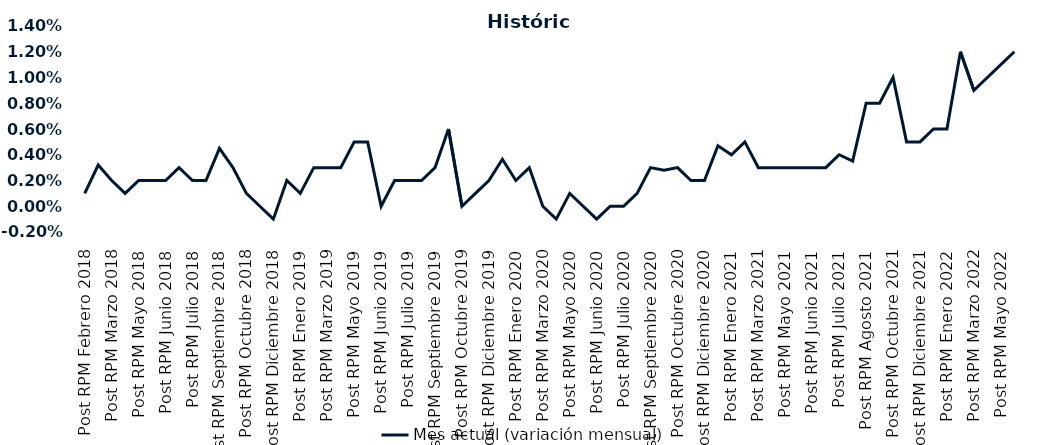
| Category | Mes actual (variación mensual)  |
|---|---|
| Post RPM Febrero 2018 | 0.001 |
| Pre RPM Marzo 2018 | 0.003 |
| Post RPM Marzo 2018 | 0.002 |
| Pre RPM Mayo 2018 | 0.001 |
| Post RPM Mayo 2018 | 0.002 |
| Pre RPM Junio 2018 | 0.002 |
| Post RPM Junio 2018 | 0.002 |
| Pre RPM Julio 2018 | 0.003 |
| Post RPM Julio 2018 | 0.002 |
| Pre RPM Septiembre 2018 | 0.002 |
| Post RPM Septiembre 2018 | 0.004 |
| Pre RPM Octubre 2018 | 0.003 |
| Post RPM Octubre 2018 | 0.001 |
| Pre RPM Diciembre 2018 | 0 |
| Post RPM Diciembre 2018 | -0.001 |
| Pre RPM Enero 2019 | 0.002 |
| Post RPM Enero 2019 | 0.001 |
| Pre RPM Marzo 2019 | 0.003 |
| Post RPM Marzo 2019 | 0.003 |
| Pre RPM Mayo 2019 | 0.003 |
| Post RPM Mayo 2019 | 0.005 |
| Pre RPM Junio 2019 | 0.005 |
| Post RPM Junio 2019 | 0 |
| Pre RPM Julio 2019 | 0.002 |
| Post RPM Julio 2019 | 0.002 |
| Pre RPM Septiembre 2019 | 0.002 |
| Post RPM Septiembre 2019 | 0.003 |
| Pre RPM Octubre 2019 | 0.006 |
| Post RPM Octubre 2019 | 0 |
| Pre RPM Diciembre 2019 | 0.001 |
| Post RPM Diciembre 2019 | 0.002 |
| Pre RPM Enero 2020 | 0.004 |
| Post RPM Enero 2020 | 0.002 |
| Pre RPM Marzo 2020 | 0.003 |
| Post RPM Marzo 2020 | 0 |
| Pre RPM Mayo 2020 | -0.001 |
| Post RPM Mayo 2020 | 0.001 |
| Pre RPM Junio 2020 | 0 |
| Post RPM Junio 2020 | -0.001 |
| Pre RPM Julio 2020 | 0 |
| Post RPM Julio 2020 | 0 |
| Pre RPM Septiembre 2020 | 0.001 |
| Post RPM Septiembre 2020 | 0.003 |
| Pre RPM Octubre 2020 | 0.003 |
| Post RPM Octubre 2020 | 0.003 |
| Pre RPM Diciembre 2020 | 0.002 |
| Post RPM Diciembre 2020 | 0.002 |
| Pre RPM Enero 2021 | 0.005 |
| Post RPM Enero 2021 | 0.004 |
| Pre RPM Marzo 2021 | 0.005 |
| Post RPM Marzo 2021 | 0.003 |
| Pre RPM Mayo 2021 | 0.003 |
| Post RPM Mayo 2021 | 0.003 |
| Pre RPM Junio 2021 | 0.003 |
| Post RPM Junio 2021 | 0.003 |
| Pre RPM Julio 2021 | 0.003 |
| Post RPM Julio 2021 | 0.004 |
| Pre RPM Agosto 2021 | 0.004 |
| Post RPM Agosto 2021 | 0.008 |
| Pre RPM Octubre 2021 | 0.008 |
| Post RPM Octubre 2021 | 0.01 |
| Pre RPM Diciembre 2021 | 0.005 |
| Post RPM Diciembre 2021 | 0.005 |
| Pre RPM Enero 2022 | 0.006 |
| Post RPM Enero 2022 | 0.006 |
| Pre RPM Marzo 2022 | 0.012 |
| Post RPM Marzo 2022 | 0.009 |
| Pre RPM Mayo 2022 | 0.01 |
| Post RPM Mayo 2022 | 0.011 |
| Pre RPM Junio 2022 | 0.012 |